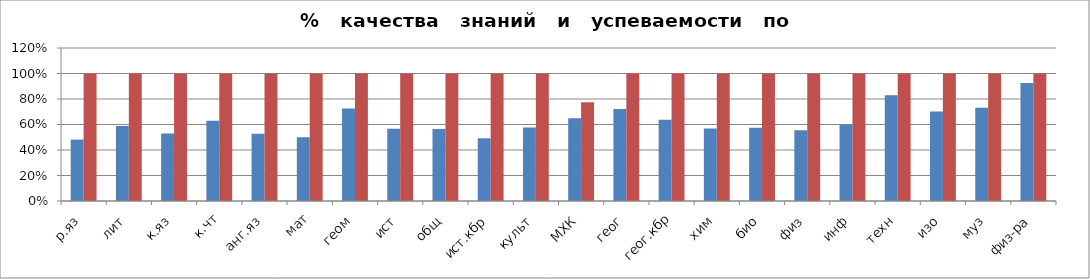
| Category | Series 0 | 2 |
|---|---|---|
| р.яз | 0.481 | 1 |
| лит | 0.587 | 1 |
| к.яз | 0.53 | 1 |
| к.чт | 0.63 | 1 |
| анг.яз | 0.527 | 1 |
| мат | 0.5 | 1 |
| геом | 0.726 | 1 |
| ист | 0.566 | 1 |
| общ | 0.566 | 1 |
| ист.кбр | 0.492 | 1 |
| культ | 0.577 | 1 |
| МХК | 0.65 | 0.775 |
| геог | 0.722 | 1 |
| геог.кбр | 0.636 | 1 |
| хим | 0.568 | 1 |
| био | 0.574 | 1 |
| физ | 0.556 | 1 |
| инф | 0.6 | 1 |
| техн | 0.829 | 1 |
| изо | 0.701 | 1 |
| муз | 0.732 | 1 |
| физ-ра | 0.926 | 1 |